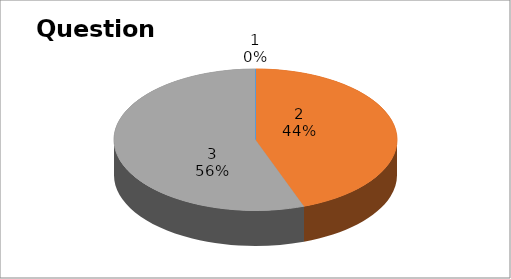
| Category | Series 0 |
|---|---|
| 0 | 0 |
| 1 | 16 |
| 2 | 20 |